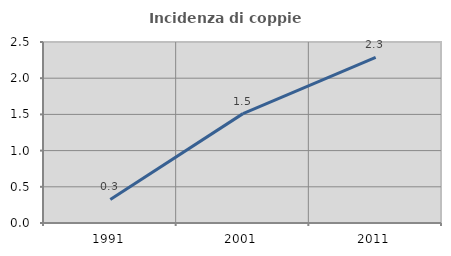
| Category | Incidenza di coppie miste |
|---|---|
| 1991.0 | 0.326 |
| 2001.0 | 1.511 |
| 2011.0 | 2.289 |